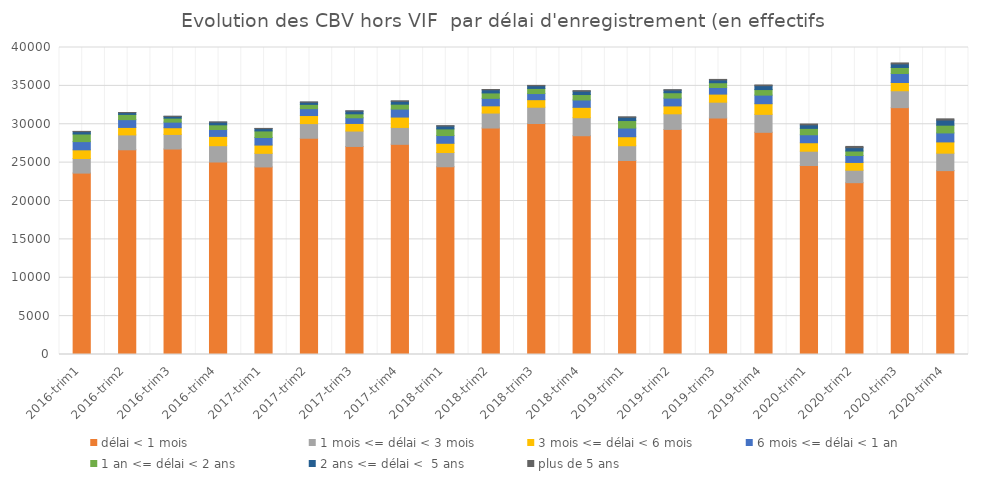
| Category | délai < 1 mois | 1 mois <= délai < 3 mois | 3 mois <= délai < 6 mois | 6 mois <= délai < 1 an | 1 an <= délai < 2 ans | 2 ans <= délai <  5 ans | plus de 5 ans |
|---|---|---|---|---|---|---|---|
| 2016-trim1 | 23636 | 1900 | 1131 | 1072 | 990 | 307 | 34 |
| 2016-trim2 | 26673 | 1939 | 974 | 1015 | 680 | 232 | 20 |
| 2016-trim3 | 26771 | 1904 | 872 | 727 | 525 | 221 | 26 |
| 2016-trim4 | 25081 | 2126 | 1212 | 899 | 609 | 339 | 36 |
| 2017-trim1 | 24438 | 1770 | 1080 | 982 | 860 | 298 | 31 |
| 2017-trim2 | 28177 | 1907 | 1051 | 895 | 558 | 278 | 41 |
| 2017-trim3 | 27107 | 2006 | 990 | 737 | 519 | 353 | 40 |
| 2017-trim4 | 27384 | 2200 | 1353 | 1037 | 639 | 372 | 69 |
| 2018-trim1 | 24461 | 1855 | 1203 | 1007 | 866 | 376 | 46 |
| 2018-trim2 | 29508 | 1950 | 941 | 977 | 705 | 406 | 42 |
| 2018-trim3 | 30094 | 2126 | 981 | 799 | 668 | 346 | 49 |
| 2018-trim4 | 28505 | 2348 | 1352 | 959 | 707 | 434 | 74 |
| 2019-trim1 | 25279 | 1923 | 1172 | 1134 | 974 | 418 | 66 |
| 2019-trim2 | 29328 | 2032 | 1027 | 1022 | 696 | 342 | 56 |
| 2019-trim3 | 30812 | 2062 | 1054 | 858 | 622 | 360 | 74 |
| 2019-trim4 | 28950 | 2337 | 1390 | 1121 | 721 | 503 | 98 |
| 2020-trim1 | 24622 | 1863 | 1106 | 1040 | 832 | 454 | 114 |
| 2020-trim2 | 22387 | 1626 | 1009 | 902 | 589 | 432 | 166 |
| 2020-trim3 | 32162 | 2202 | 1075 | 1173 | 786 | 463 | 129 |
| 2020-trim4 | 23959 | 2272 | 1467 | 1172 | 1009 | 662 | 164 |